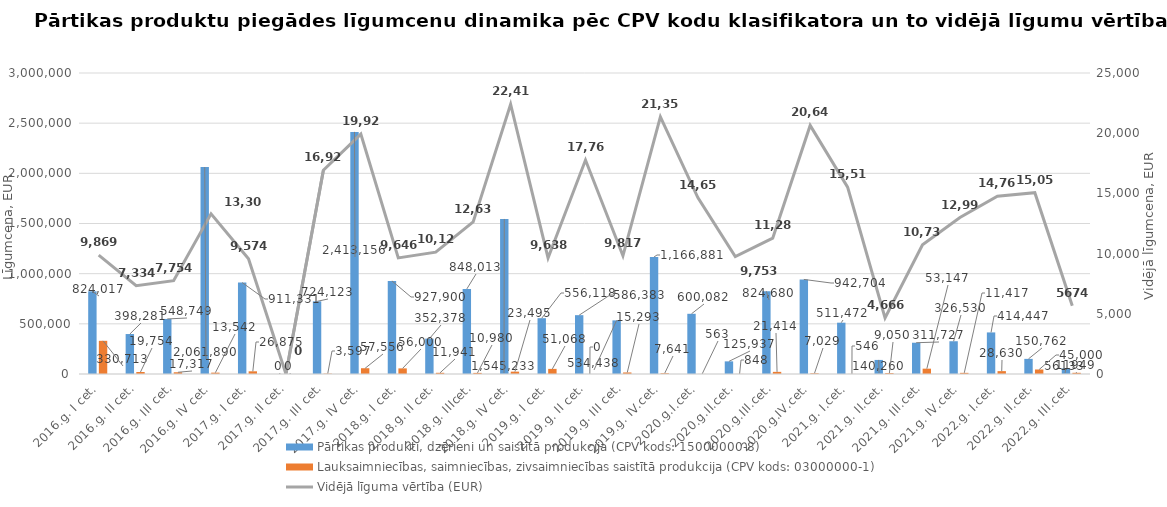
| Category | Pārtikas produkti, dzērieni un saistītā produkcija (CPV kods: 15000000-8) | Lauksaimniecības, saimniecības, zivsaimniecības saistītā produkcija (CPV kods: 03000000-1) |
|---|---|---|
| 2016.g. I cet. | 824017 | 330713 |
| 2016.g. II cet. | 398281 | 19754 |
| 2016.g. III cet. | 548749.01 | 17317 |
| 2016.g. IV cet. | 2061890 | 13542 |
| 2017.g. I cet. | 911330.81 | 26874.91 |
| 2017.g. II cet. | 0 | 0 |
| 2017.g. III cet. | 724123.07 | 3596.6 |
| 2017.g. IV cet. | 2413156 | 57556 |
| 2018.g. I cet. | 927900 | 56000 |
| 2018.g. II cet. | 352378 | 11941 |
| 2018.g. IIIcet. | 848013 | 10980 |
| 2018.g. IV cet. | 1545233 | 23495 |
| 2019.g. I cet. | 556118 | 51068 |
| 2019.g. II cet. | 586383 | 0 |
| 2019.g. III cet. | 534438 | 15293 |
| 2019.g. IV.cet. | 1166881 | 7641 |
| 2020.g.I.cet. | 600082 | 563 |
| 2020.g.II.cet. | 125937 | 848 |
| 2020.g.III.cet. | 824680 | 21414 |
| 2020.g.IV.cet. | 942704 | 7029 |
| 2021.g. I.cet. | 511472 | 546 |
| 2021.g. II.cet. | 140260 | 9050 |
| 2021.g. III.cet. | 311727 | 53147 |
| 2021.g. IV.cet. | 326530 | 11417 |
| 2022.g. I.cet. | 414447 | 28630 |
| 2022.g. II.cet. | 150762 | 45000 |
| 2022.g. III.cet. | 56133 | 11949 |